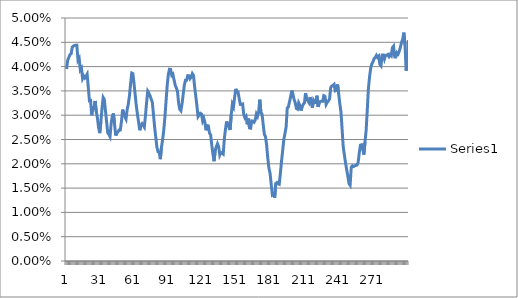
| Category | Series 0 |
|---|---|
| 0 | 0.039 |
| 1 | 0.041 |
| 2 | 0.042 |
| 3 | 0.042 |
| 4 | 0.043 |
| 5 | 0.044 |
| 6 | 0.044 |
| 7 | 0.044 |
| 8 | 0.044 |
| 9 | 0.044 |
| 10 | 0.041 |
| 11 | 0.042 |
| 12 | 0.039 |
| 13 | 0.04 |
| 14 | 0.038 |
| 15 | 0.038 |
| 16 | 0.038 |
| 17 | 0.038 |
| 18 | 0.038 |
| 19 | 0.036 |
| 20 | 0.033 |
| 21 | 0.033 |
| 22 | 0.03 |
| 23 | 0.032 |
| 24 | 0.031 |
| 25 | 0.033 |
| 26 | 0.031 |
| 27 | 0.029 |
| 28 | 0.027 |
| 29 | 0.026 |
| 30 | 0.029 |
| 31 | 0.031 |
| 32 | 0.034 |
| 33 | 0.033 |
| 34 | 0.031 |
| 35 | 0.029 |
| 36 | 0.026 |
| 37 | 0.026 |
| 38 | 0.026 |
| 39 | 0.028 |
| 40 | 0.03 |
| 41 | 0.03 |
| 42 | 0.028 |
| 43 | 0.026 |
| 44 | 0.026 |
| 45 | 0.027 |
| 46 | 0.027 |
| 47 | 0.027 |
| 48 | 0.029 |
| 49 | 0.031 |
| 50 | 0.03 |
| 51 | 0.03 |
| 52 | 0.029 |
| 53 | 0.031 |
| 54 | 0.032 |
| 55 | 0.034 |
| 56 | 0.036 |
| 57 | 0.039 |
| 58 | 0.039 |
| 59 | 0.037 |
| 60 | 0.034 |
| 61 | 0.032 |
| 62 | 0.03 |
| 63 | 0.029 |
| 64 | 0.027 |
| 65 | 0.028 |
| 66 | 0.028 |
| 67 | 0.028 |
| 68 | 0.028 |
| 69 | 0.03 |
| 70 | 0.033 |
| 71 | 0.035 |
| 72 | 0.035 |
| 73 | 0.034 |
| 74 | 0.033 |
| 75 | 0.033 |
| 76 | 0.03 |
| 77 | 0.028 |
| 78 | 0.026 |
| 79 | 0.023 |
| 80 | 0.022 |
| 81 | 0.022 |
| 82 | 0.021 |
| 83 | 0.023 |
| 84 | 0.025 |
| 85 | 0.027 |
| 86 | 0.03 |
| 87 | 0.033 |
| 88 | 0.036 |
| 89 | 0.038 |
| 90 | 0.039 |
| 91 | 0.039 |
| 92 | 0.038 |
| 93 | 0.038 |
| 94 | 0.037 |
| 95 | 0.036 |
| 96 | 0.036 |
| 97 | 0.035 |
| 98 | 0.032 |
| 99 | 0.031 |
| 100 | 0.031 |
| 101 | 0.032 |
| 102 | 0.034 |
| 103 | 0.036 |
| 104 | 0.037 |
| 105 | 0.037 |
| 106 | 0.038 |
| 107 | 0.038 |
| 108 | 0.038 |
| 109 | 0.038 |
| 110 | 0.039 |
| 111 | 0.038 |
| 112 | 0.036 |
| 113 | 0.034 |
| 114 | 0.032 |
| 115 | 0.03 |
| 116 | 0.03 |
| 117 | 0.03 |
| 118 | 0.03 |
| 119 | 0.029 |
| 120 | 0.029 |
| 121 | 0.028 |
| 122 | 0.027 |
| 123 | 0.028 |
| 124 | 0.028 |
| 125 | 0.026 |
| 126 | 0.026 |
| 127 | 0.024 |
| 128 | 0.022 |
| 129 | 0.021 |
| 130 | 0.023 |
| 131 | 0.024 |
| 132 | 0.024 |
| 133 | 0.024 |
| 134 | 0.022 |
| 135 | 0.022 |
| 136 | 0.022 |
| 137 | 0.022 |
| 138 | 0.025 |
| 139 | 0.027 |
| 140 | 0.029 |
| 141 | 0.028 |
| 142 | 0.028 |
| 143 | 0.027 |
| 144 | 0.03 |
| 145 | 0.032 |
| 146 | 0.032 |
| 147 | 0.034 |
| 148 | 0.035 |
| 149 | 0.035 |
| 150 | 0.035 |
| 151 | 0.033 |
| 152 | 0.032 |
| 153 | 0.032 |
| 154 | 0.032 |
| 155 | 0.03 |
| 156 | 0.029 |
| 157 | 0.03 |
| 158 | 0.028 |
| 159 | 0.029 |
| 160 | 0.027 |
| 161 | 0.027 |
| 162 | 0.029 |
| 163 | 0.029 |
| 164 | 0.029 |
| 165 | 0.029 |
| 166 | 0.03 |
| 167 | 0.03 |
| 168 | 0.031 |
| 169 | 0.033 |
| 170 | 0.03 |
| 171 | 0.03 |
| 172 | 0.028 |
| 173 | 0.026 |
| 174 | 0.026 |
| 175 | 0.024 |
| 176 | 0.021 |
| 177 | 0.019 |
| 178 | 0.018 |
| 179 | 0.016 |
| 180 | 0.014 |
| 181 | 0.014 |
| 182 | 0.013 |
| 183 | 0.016 |
| 184 | 0.016 |
| 185 | 0.016 |
| 186 | 0.016 |
| 187 | 0.018 |
| 188 | 0.021 |
| 189 | 0.023 |
| 190 | 0.025 |
| 191 | 0.026 |
| 192 | 0.028 |
| 193 | 0.031 |
| 194 | 0.032 |
| 195 | 0.033 |
| 196 | 0.034 |
| 197 | 0.035 |
| 198 | 0.034 |
| 199 | 0.033 |
| 200 | 0.033 |
| 201 | 0.031 |
| 202 | 0.031 |
| 203 | 0.033 |
| 204 | 0.032 |
| 205 | 0.031 |
| 206 | 0.032 |
| 207 | 0.032 |
| 208 | 0.032 |
| 209 | 0.035 |
| 210 | 0.033 |
| 211 | 0.033 |
| 212 | 0.033 |
| 213 | 0.034 |
| 214 | 0.033 |
| 215 | 0.032 |
| 216 | 0.033 |
| 217 | 0.033 |
| 218 | 0.033 |
| 219 | 0.034 |
| 220 | 0.032 |
| 221 | 0.033 |
| 222 | 0.033 |
| 223 | 0.033 |
| 224 | 0.033 |
| 225 | 0.034 |
| 226 | 0.034 |
| 227 | 0.032 |
| 228 | 0.033 |
| 229 | 0.033 |
| 230 | 0.033 |
| 231 | 0.036 |
| 232 | 0.036 |
| 233 | 0.036 |
| 234 | 0.036 |
| 235 | 0.035 |
| 236 | 0.035 |
| 237 | 0.036 |
| 238 | 0.034 |
| 239 | 0.032 |
| 240 | 0.031 |
| 241 | 0.027 |
| 242 | 0.023 |
| 243 | 0.022 |
| 244 | 0.02 |
| 245 | 0.019 |
| 246 | 0.017 |
| 247 | 0.016 |
| 248 | 0.016 |
| 249 | 0.019 |
| 250 | 0.02 |
| 251 | 0.019 |
| 252 | 0.02 |
| 253 | 0.02 |
| 254 | 0.02 |
| 255 | 0.02 |
| 256 | 0.022 |
| 257 | 0.024 |
| 258 | 0.024 |
| 259 | 0.023 |
| 260 | 0.022 |
| 261 | 0.024 |
| 262 | 0.027 |
| 263 | 0.031 |
| 264 | 0.036 |
| 265 | 0.038 |
| 266 | 0.04 |
| 267 | 0.041 |
| 268 | 0.041 |
| 269 | 0.042 |
| 270 | 0.042 |
| 271 | 0.042 |
| 272 | 0.042 |
| 273 | 0.042 |
| 274 | 0.04 |
| 275 | 0.04 |
| 276 | 0.042 |
| 277 | 0.042 |
| 278 | 0.042 |
| 279 | 0.042 |
| 280 | 0.042 |
| 281 | 0.043 |
| 282 | 0.042 |
| 283 | 0.042 |
| 284 | 0.042 |
| 285 | 0.044 |
| 286 | 0.044 |
| 287 | 0.042 |
| 288 | 0.042 |
| 289 | 0.043 |
| 290 | 0.043 |
| 291 | 0.043 |
| 292 | 0.044 |
| 293 | 0.045 |
| 294 | 0.046 |
| 295 | 0.047 |
| 296 | 0.044 |
| 297 | 0.039 |
| 298 | 0.041 |
| 299 | 0.045 |